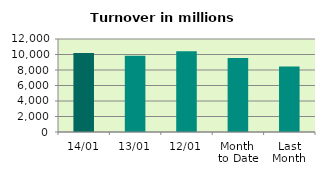
| Category | Series 0 |
|---|---|
| 14/01 | 10207.573 |
| 13/01 | 9824.542 |
| 12/01 | 10409.082 |
| Month 
to Date | 9544.37 |
| Last
Month | 8461.957 |